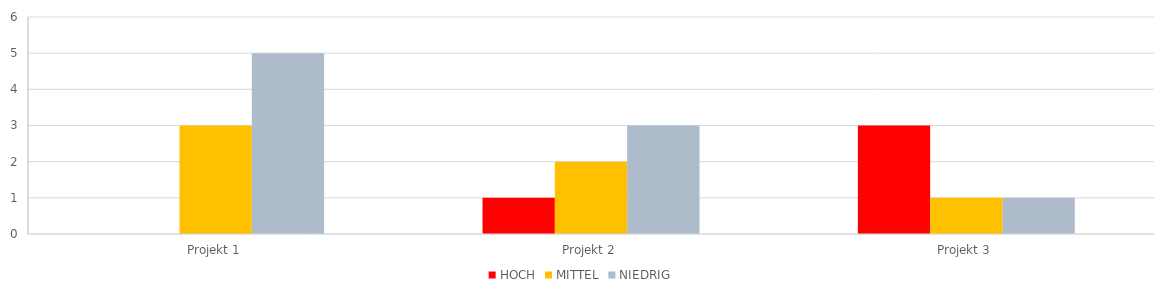
| Category | HOCH | MITTEL | NIEDRIG |
|---|---|---|---|
| Projekt 1 | 0 | 3 | 5 |
| Projekt 2 | 1 | 2 | 3 |
| Projekt 3 | 3 | 1 | 1 |